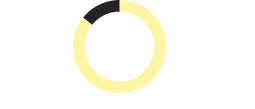
| Category | Series 0 |
|---|---|
| Zielerreichung | 0.857 |
| Delta Kreis | 0.143 |